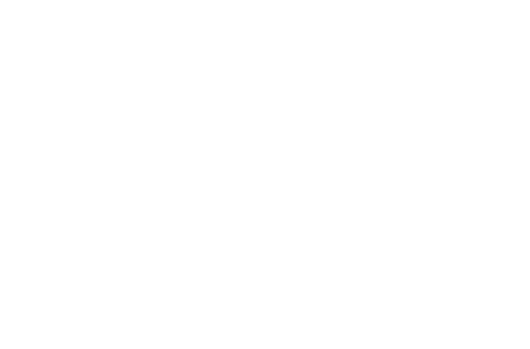
| Category | Betalt hovedstol | Betalte renter |
|---|---|---|
| 2021 | 125.673 | 91.379 |
| 2022 | 904.335 | 615.033 |
| 2023 | 1726.919 | 1094.764 |
| 2024 | 2595.904 | 1528.095 |
| 2025 | 3513.906 | 1912.408 |
| 2026 | 4483.69 | 2244.939 |
| 2027 | 5508.178 | 2522.766 |
| 2028 | 6590.456 | 2742.804 |
| 2029 | 7733.782 | 2901.793 |
| 2030 | 8941.601 | 2996.29 |
| 2031 | 10000 | 3023.153 |